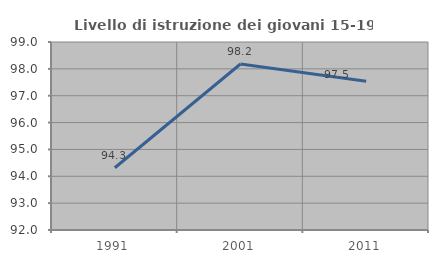
| Category | Livello di istruzione dei giovani 15-19 anni |
|---|---|
| 1991.0 | 94.318 |
| 2001.0 | 98.182 |
| 2011.0 | 97.541 |